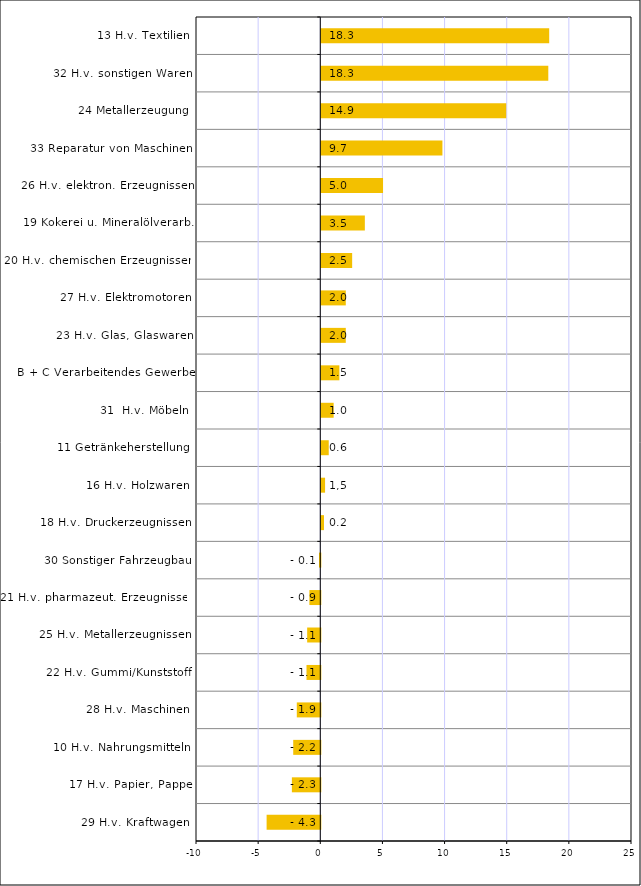
| Category | Series 0 |
|---|---|
| 29 H.v. Kraftwagen | -4.319 |
| 17 H.v. Papier, Pappe | -2.286 |
| 10 H.v. Nahrungsmitteln | -2.178 |
| 28 H.v. Maschinen | -1.89 |
| 22 H.v. Gummi/Kunststoff | -1.109 |
| 25 H.v. Metallerzeugnissen | -1.056 |
| 21 H.v. pharmazeut. Erzeugnissen | -0.878 |
| 30 Sonstiger Fahrzeugbau | -0.105 |
| 18 H.v. Druckerzeugnissen | 0.216 |
| 16 H.v. Holzwaren | 0.305 |
| 11 Getränkeherstellung | 0.6 |
| 31  H.v. Möbeln | 0.995 |
| B + C Verarbeitendes Gewerbe | 1.454 |
| 23 H.v. Glas, Glaswaren | 1.972 |
| 27 H.v. Elektromotoren | 1.972 |
| 20 H.v. chemischen Erzeugnissen | 2.484 |
| 19 Kokerei u. Mineralölverarb. | 3.505 |
| 26 H.v. elektron. Erzeugnissen | 4.969 |
| 33 Reparatur von Maschinen | 9.746 |
| 24 Metallerzeugung | 14.88 |
| 32 H.v. sonstigen Waren | 18.265 |
| 13 H.v. Textilien | 18.337 |